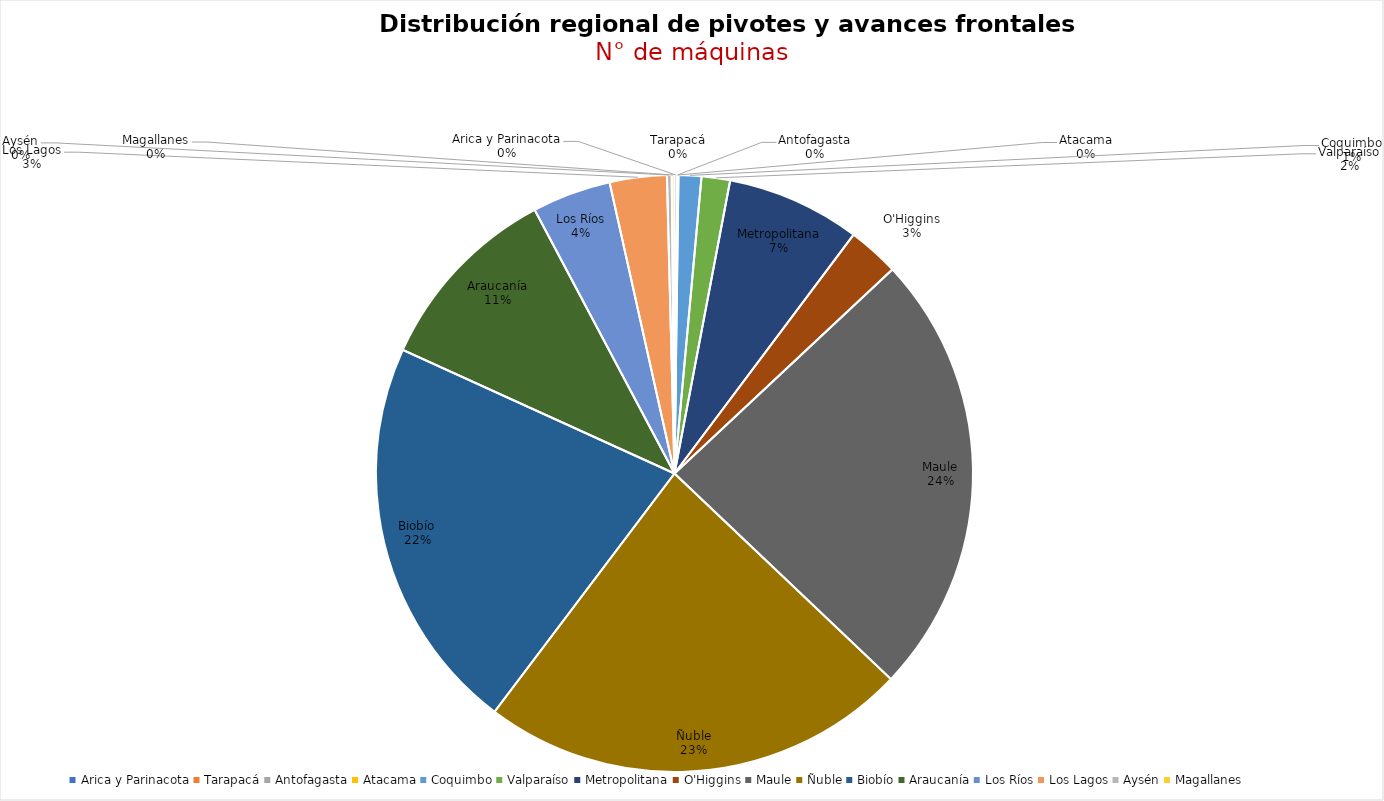
| Category | N° pivotes |
|---|---|
| Arica y Parinacota | 3 |
| Tarapacá | 0 |
| Antofagasta | 0 |
| Atacama | 1 |
| Coquimbo | 24 |
| Valparaíso | 30 |
| Metropolitana | 141 |
| O'Higgins | 54 |
| Maule | 468 |
| Ñuble | 451 |
| Biobío | 418 |
| Araucanía | 203 |
| Los Ríos | 83 |
| Los Lagos | 60 |
| Aysén | 5 |
| Magallanes | 3 |